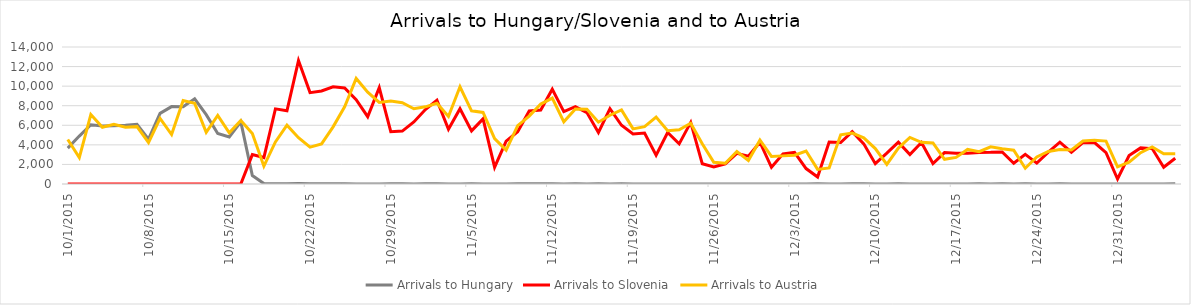
| Category | Arrivals to Hungary | Arrivals to Slovenia | Arrivals to Austria |
|---|---|---|---|
| 10/1/15 | 3667 | 0 | 4550 |
| 10/2/15 | 4897 | 0 | 2700 |
| 10/3/15 | 6056 | 0 | 7100 |
| 10/4/15 | 5925 | 0 | 5800 |
| 10/5/15 | 5952 | 0 | 6100 |
| 10/6/15 | 6000 | 0 | 5800 |
| 10/7/15 | 6103 | 0 | 5861 |
| 10/8/15 | 4583 | 6 | 4229 |
| 10/9/15 | 7215 | 0 | 6700 |
| 10/10/15 | 7907 | 0 | 5050 |
| 10/11/15 | 7897 | 0 | 8540 |
| 10/12/15 | 8702 | 0 | 8240 |
| 10/13/15 | 7081 | 0 | 5280 |
| 10/14/15 | 5157 | 0 | 7000 |
| 10/15/15 | 4808 | 0 | 5235 |
| 10/16/15 | 6353 | 0 | 6500 |
| 10/17/15 | 870 | 3000 | 5155 |
| 10/18/15 | 41 | 2700 | 1822 |
| 10/19/15 | 22 | 7677 | 4300 |
| 10/20/15 | 36 | 7478 | 6017 |
| 10/21/15 | 39 | 12616 | 4737 |
| 10/22/15 | 32 | 9339 | 3767 |
| 10/23/15 | 29 | 9500 | 4092 |
| 10/24/15 | 35 | 9925 | 5841 |
| 10/25/15 | 34 | 9818 | 7882 |
| 10/26/15 | 12 | 8625 | 10784 |
| 10/27/15 | 7 | 6877 | 9390 |
| 10/28/15 | 4 | 9848 | 8336 |
| 10/29/15 | 23 | 5341 | 8473 |
| 10/30/15 | 18 | 5409 | 8302 |
| 10/31/15 | 10 | 6344 | 7691 |
| 11/1/15 | 14 | 7611 | 7887 |
| 11/2/15 | 31 | 8568 | 8243 |
| 11/3/15 | 8 | 5591 | 6900 |
| 11/4/15 | 10 | 7693 | 9930 |
| 11/5/15 | 18 | 5426 | 7478 |
| 11/6/15 | 4 | 6655 | 7315 |
| 11/7/15 | 8 | 1716 | 4648 |
| 11/8/15 | 9 | 4381 | 3465 |
| 11/9/15 | 25 | 5341 | 5962 |
| 11/10/15 | 14 | 7457 | 6933 |
| 11/11/15 | 13 | 7554 | 8169 |
| 11/12/15 | 23 | 9681 | 8777 |
| 11/13/15 | 6 | 7397 | 6351 |
| 11/14/15 | 21 | 7905 | 7659 |
| 11/15/15 | 8 | 7300 | 7632 |
| 11/16/15 | 15 | 5261 | 6319 |
| 11/17/15 | 5 | 7704 | 7026 |
| 11/18/15 | 15 | 5998 | 7577 |
| 11/19/15 | 4 | 5119 | 5635 |
| 11/20/15 | 9 | 5211 | 5865 |
| 11/21/15 | 2 | 2952 | 6836 |
| 11/22/15 | 11 | 5260 | 5446 |
| 11/23/15 | 4 | 4102 | 5546 |
| 11/24/15 | 4 | 6297 | 6204 |
| 11/25/15 | 6 | 2070 | 4122 |
| 11/26/15 | 10 | 1742 | 2211 |
| 11/27/15 | 2 | 2065 | 2120 |
| 11/28/15 | 6 | 3139 | 3320 |
| 11/29/15 | 3 | 2843 | 2407 |
| 11/30/15 | 7 | 4274 | 4482 |
| 12/1/15 | 4 | 1709 | 2821 |
| 12/2/15 | 4 | 3077 | 2874 |
| 12/3/15 | 9 | 3237 | 2935 |
| 12/4/15 | 1 | 1577 | 3366 |
| 12/5/15 | 31 | 715 | 1493 |
| 12/6/15 | 7 | 4288 | 1643 |
| 12/7/15 | 0 | 4240 | 5035 |
| 12/8/15 | 13 | 5351 | 5210 |
| 12/9/15 | 14 | 4103 | 4714 |
| 12/10/15 | 3 | 2078 | 3623 |
| 12/11/15 | 0 | 3149 | 2000 |
| 12/12/15 | 13 | 4271 | 3675 |
| 12/13/15 | 10 | 3016 | 4754 |
| 12/14/15 | 3 | 4250 | 4263 |
| 12/15/15 | 2 | 2098 | 4193 |
| 12/16/15 | 6 | 3214 | 2519 |
| 12/17/15 | 0 | 3135 | 2717 |
| 12/18/15 | 11 | 3150 | 3532 |
| 12/19/15 | 31 | 3222 | 3305 |
| 12/20/15 | 8 | 3233 | 3800 |
| 12/21/15 | 25 | 3278 | 3611 |
| 12/22/15 | 1 | 2118 | 3451 |
| 12/23/15 | 21 | 3030 | 1613 |
| 12/24/15 | 8 | 2131 | 2764 |
| 12/25/15 | 2 | 3257 | 3321 |
| 12/26/15 | 17 | 4274 | 3532 |
| 12/27/15 | 10 | 3253 | 3476 |
| 12/28/15 | 0 | 4228 | 4394 |
| 12/29/15 | 0 | 4239 | 4468 |
| 12/30/15 | 11 | 3195 | 4386 |
| 12/31/15 | 5 | 511 | 1756 |
| 1/1/16 | 0 | 2914 | 2226 |
| 1/2/16 | 0 | 3690 | 3199 |
| 1/3/16 | 0 | 3619 | 3793 |
| 1/4/16 | 0 | 1708 | 3085 |
| 1/5/16 | 18 | 2626 | 3091 |